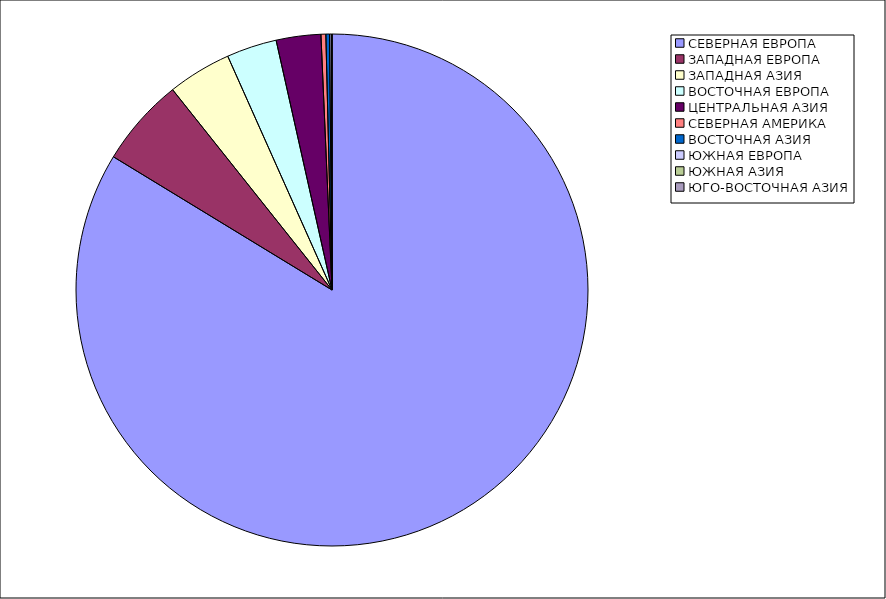
| Category | Оборот |
|---|---|
| СЕВЕРНАЯ ЕВРОПА | 83.71 |
| ЗАПАДНАЯ ЕВРОПА | 5.591 |
| ЗАПАДНАЯ АЗИЯ | 4.024 |
| ВОСТОЧНАЯ ЕВРОПА | 3.17 |
| ЦЕНТРАЛЬНАЯ АЗИЯ | 2.816 |
| СЕВЕРНАЯ АМЕРИКА | 0.306 |
| ВОСТОЧНАЯ АЗИЯ | 0.23 |
| ЮЖНАЯ ЕВРОПА | 0.107 |
| ЮЖНАЯ АЗИЯ | 0.045 |
| ЮГО-ВОСТОЧНАЯ АЗИЯ | 0 |